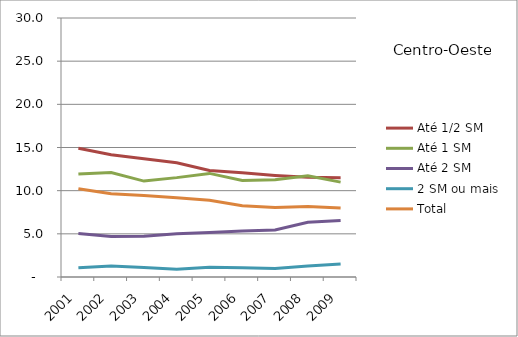
| Category | Até 1/2 SM | Até 1 SM | Até 2 SM | 2 SM ou mais | Total |
|---|---|---|---|---|---|
| 2001.0 | 14.92 | 11.92 | 5.04 | 1.07 | 10.22 |
| 2002.0 | 14.15 | 12.1 | 4.69 | 1.28 | 9.64 |
| 2003.0 | 13.69 | 11.11 | 4.72 | 1.11 | 9.45 |
| 2004.0 | 13.23 | 11.51 | 5.01 | 0.9 | 9.18 |
| 2005.0 | 12.34 | 12 | 5.15 | 1.12 | 8.9 |
| 2006.0 | 12.08 | 11.17 | 5.33 | 1.07 | 8.25 |
| 2007.0 | 11.77 | 11.26 | 5.44 | 0.99 | 8.05 |
| 2008.0 | 11.54 | 11.73 | 6.33 | 1.27 | 8.18 |
| 2009.0 | 11.5 | 10.99 | 6.55 | 1.51 | 7.99 |